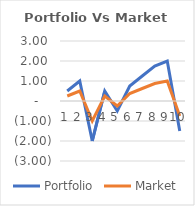
| Category | Portfolio | Market |
|---|---|---|
| 0 | 0.5 | 0.25 |
| 1 | 1 | 0.5 |
| 2 | -2 | -1 |
| 3 | 0.5 | 0.25 |
| 4 | -0.5 | -0.25 |
| 5 | 0.75 | 0.375 |
| 6 | 1.25 | 0.625 |
| 7 | 1.75 | 0.875 |
| 8 | 2 | 1 |
| 9 | -1.5 | -0.75 |